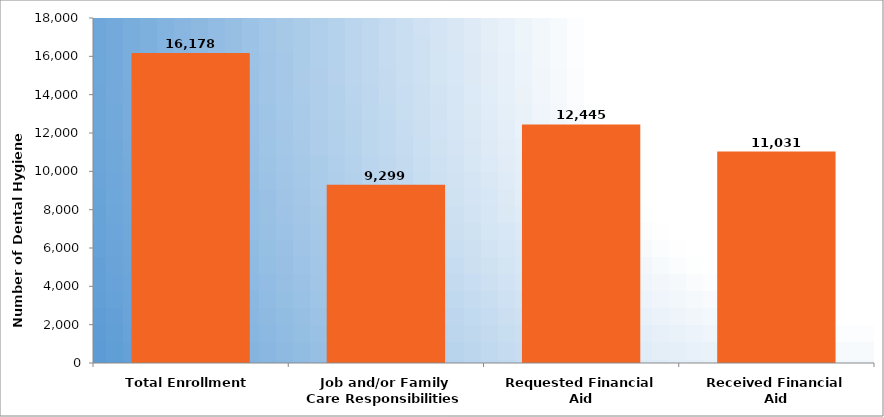
| Category | Number of Dental Hygiene Students |
|---|---|
| Total Enrollment | 16178 |
| Job and/or Family Care Responsibilities | 9299 |
| Requested Financial Aid | 12445 |
| Received Financial Aid | 11031 |